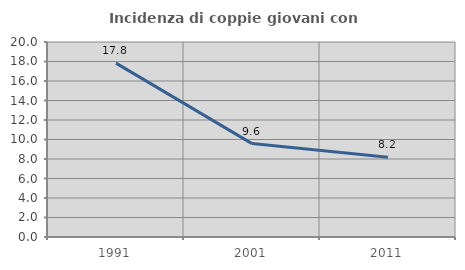
| Category | Incidenza di coppie giovani con figli |
|---|---|
| 1991.0 | 17.829 |
| 2001.0 | 9.581 |
| 2011.0 | 8.187 |